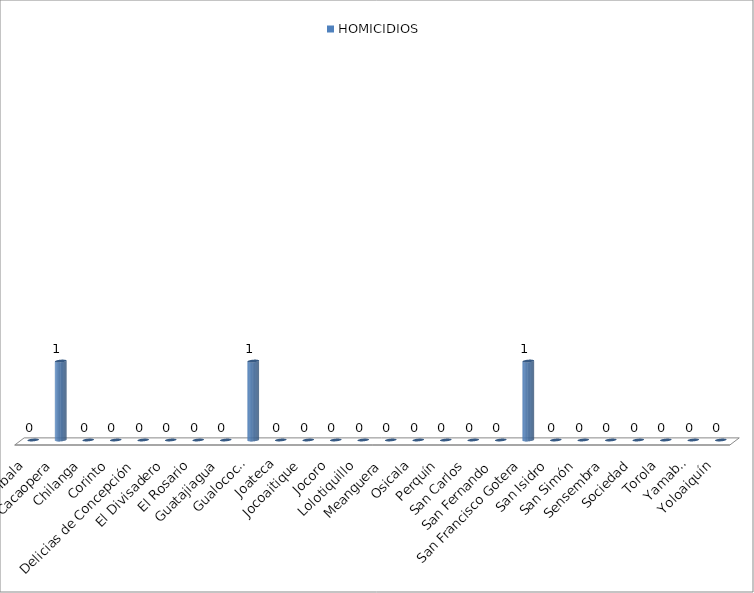
| Category | HOMICIDIOS |
|---|---|
| Arambala | 0 |
| Cacaopera | 1 |
| Chilanga | 0 |
| Corinto | 0 |
| Delicias de Concepción | 0 |
| El Divisadero | 0 |
| El Rosario | 0 |
| Guatajiagua | 0 |
| Gualococti | 1 |
| Joateca | 0 |
| Jocoaitique | 0 |
| Jocoro | 0 |
| Lolotiquillo | 0 |
| Meanguera | 0 |
| Osicala | 0 |
| Perquín | 0 |
| San Carlos | 0 |
| San Fernando | 0 |
| San Francisco Gotera | 1 |
| San Isidro | 0 |
| San Simón | 0 |
| Sensembra | 0 |
| Sociedad | 0 |
| Torola | 0 |
| Yamabal | 0 |
| Yoloaiquín | 0 |